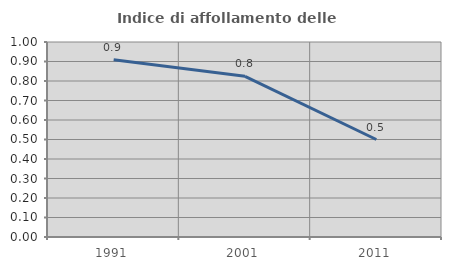
| Category | Indice di affollamento delle abitazioni  |
|---|---|
| 1991.0 | 0.909 |
| 2001.0 | 0.824 |
| 2011.0 | 0.5 |